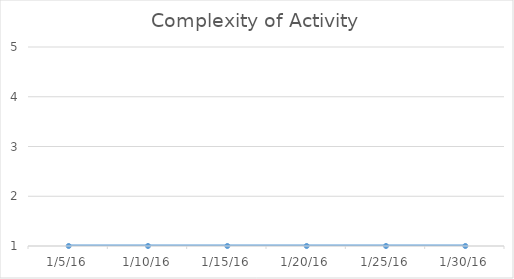
| Category | Series 0 |
|---|---|
| 1/5/16 | 1 |
| 1/10/16 | 1 |
| 1/15/16 | 1 |
| 1/20/16 | 1 |
| 1/25/16 | 1 |
| 1/30/16 | 1 |